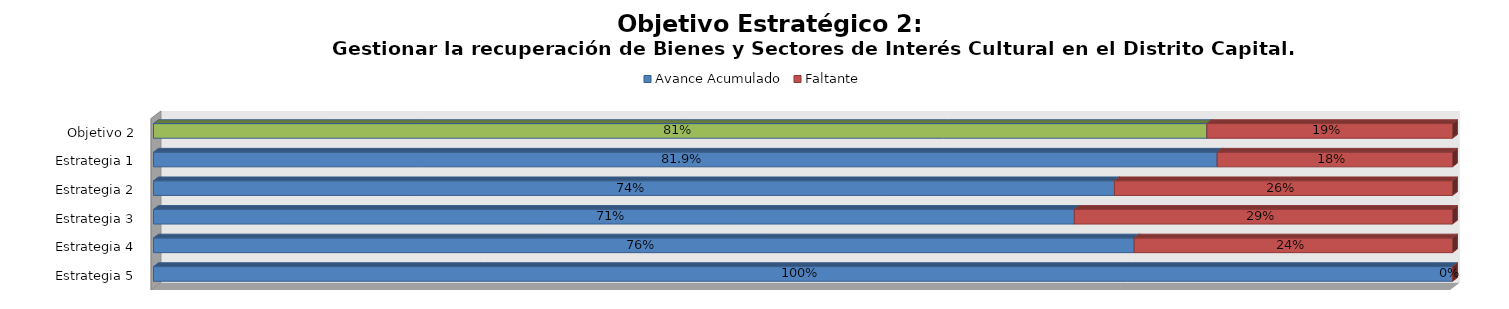
| Category | Avance Acumulado | Faltante |
|---|---|---|
| Estrategia 5 | 1 | 0 |
| Estrategia 4 | 0.755 | 0.245 |
| Estrategia 3 | 0.709 | 0.291 |
| Estrategia 2 | 0.74 | 0.26 |
| Estrategia 1 | 0.819 | 0.181 |
| Objetivo 2 | 0.811 | 0.189 |